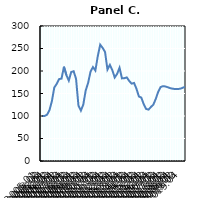
| Category | Metals  |
|---|---|
| 2005:01 | 100 |
| 2005:02 | 100.21 |
| 2005:03 | 102.735 |
| 2005:04 | 112.973 |
| 2006:01 | 132.819 |
| 2006:02 | 163.394 |
| 2006:03 | 171.459 |
| 2006:04 | 181.978 |
| 2007:01 | 183.17 |
| 2007:02 | 209.537 |
| 2007:03 | 191.024 |
| 2007:04 | 178.612 |
| 2008:01 | 197.686 |
| 2008:02 | 199.509 |
| 2008:03 | 182.679 |
| 2008:04 | 123.072 |
| 2009:01 | 111.992 |
| 2009:02 | 125.386 |
| 2009:03 | 156.872 |
| 2009:04 | 173.633 |
| 2010:01 | 198.738 |
| 2010:02 | 208.766 |
| 2010:03 | 200.982 |
| 2010:04 | 233.17 |
| 2011:01 | 258.485 |
| 2011:02 | 251.403 |
| 2011:03 | 242.356 |
| 2011:04 | 203.226 |
| 2012:01 | 213.604 |
| 2012:02 | 201.964 |
| 2012:03 | 185.624 |
| 2012:04 | 193.548 |
| 2013:01 | 207.293 |
| 2013:02 | 183.59 |
| 2013:03 | 184.081 |
| 2013:04 | 185.694 |
| 2014:01 | 177.91 |
| 2014:02 | 171.879 |
| 2014:03 | 173.422 |
| 2014:04 | 160.519 |
| 2015:01 | 143.478 |
| 2015:02 | 140.954 |
| 2015:03 | 126.297 |
| 2015:04 | 115.638 |
| 2016:01 | 114.236 |
| 2016:02 | 120.126 |
| 2016:03 | 125.386 |
| 2016:04 | 138.219 |
| 2017:01 | 153.787 |
| 2017:02 | 164.264 |
| 2017:03 | 166.352 |
| 2017:04 | 165.637 |
| 2018:01 | 163.758 |
| 2018:02 | 161.866 |
| 2018:03 | 160.626 |
| 2018:04 | 159.877 |
| 2019:01 | 159.812 |
| 2019:02 | 160.586 |
| 2019:03 | 162.266 |
| 2019:04 | 164.869 |